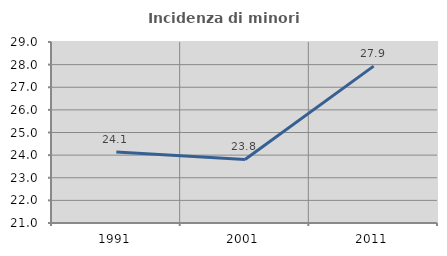
| Category | Incidenza di minori stranieri |
|---|---|
| 1991.0 | 24.138 |
| 2001.0 | 23.81 |
| 2011.0 | 27.935 |